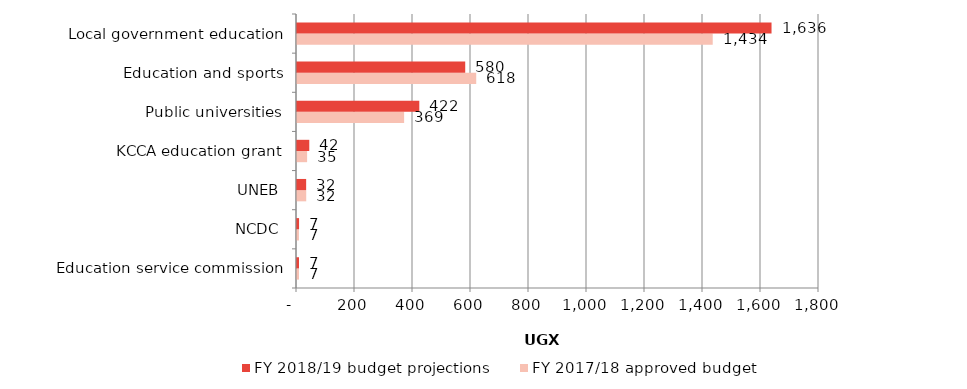
| Category | FY 2017/18 approved budget | FY 2018/19 budget projections |
|---|---|---|
| Education service commission | 6.91 | 6.96 |
| NCDC | 6.68 | 7.13 |
| UNEB | 31.78 | 31.54 |
| KCCA education grant | 34.84 | 42.36 |
| Public universities | 369.36 | 421.73 |
| Education and sports | 618.02 | 580.07 |
| Local government education | 1433.53 | 1636.34 |